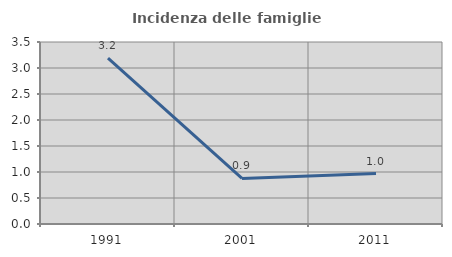
| Category | Incidenza delle famiglie numerose |
|---|---|
| 1991.0 | 3.19 |
| 2001.0 | 0.877 |
| 2011.0 | 0.97 |